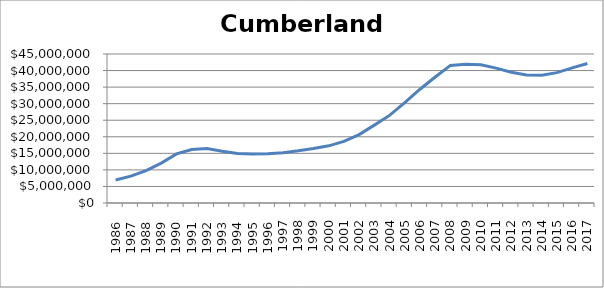
| Category | Cumberland (000s) |
|---|---|
|       1986 | 6931050 |
|       1987 | 8097600 |
|       1988 | 9796350 |
|       1989 | 12034450 |
|       1990 | 14844500 |
|       1991 | 16175050 |
|       1992 | 16478600 |
|       1993 | 15614300 |
|       1994 | 14959800 |
|       1995 | 14773150 |
|       1996 | 14902350 |
| 1997 | 15200650 |
| 1998 | 15771650 |
| 1999 | 16460400 |
| 2000 | 17259900 |
| 2001 | 18603450 |
| 2002 | 20644000 |
| 2003 | 23513650 |
| 2004 | 26458600 |
| 2005 | 30301350 |
| 2006 | 34366000 |
| 2007 | 38041800 |
| 2008 | 41557850 |
| 2009 | 41918400 |
| 2010 | 41772500 |
| 2011 | 40729950 |
| 2012 | 39497000 |
| 2013 | 38690850 |
| 2014 | 38619800 |
| 2015 | 39379600 |
| 2016 | 40806800 |
| 2017 | 42139850 |